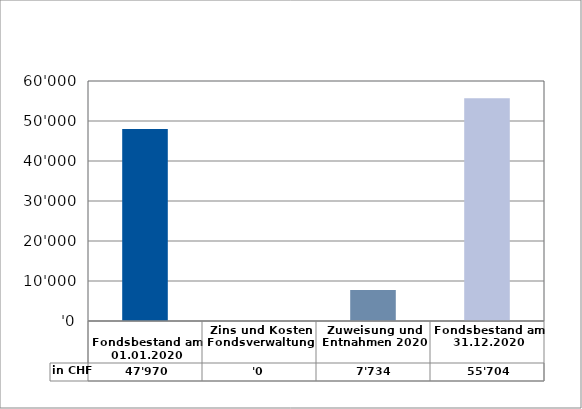
| Category | in CHF |
|---|---|
| 
Fondsbestand am 01.01.2020

 | 47970 |
| Zins und Kosten Fondsverwaltung | 0 |
| Zuweisung und Entnahmen 2020 | 7734.25 |
| Fondsbestand am 31.12.2020 | 55704.25 |